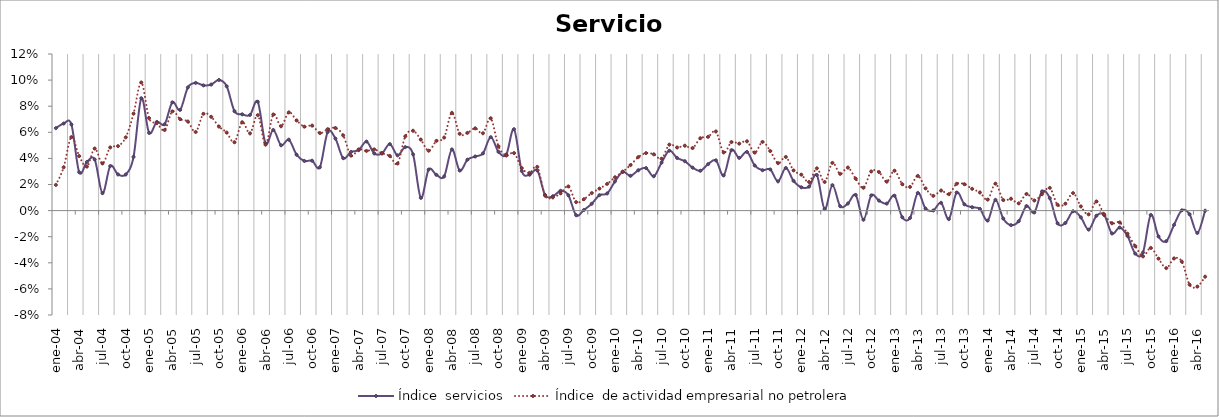
| Category | Índice  servicios | Índice  de actividad empresarial no petrolera |
|---|---|---|
| 2004-01-01 | 0.063 | 0.02 |
| 2004-02-01 | 0.067 | 0.033 |
| 2004-03-01 | 0.066 | 0.056 |
| 2004-04-01 | 0.029 | 0.042 |
| 2004-05-01 | 0.037 | 0.034 |
| 2004-06-01 | 0.039 | 0.048 |
| 2004-07-01 | 0.013 | 0.036 |
| 2004-08-01 | 0.034 | 0.048 |
| 2004-09-01 | 0.028 | 0.049 |
| 2004-10-01 | 0.028 | 0.056 |
| 2004-11-01 | 0.041 | 0.074 |
| 2004-12-01 | 0.086 | 0.098 |
| 2005-01-01 | 0.06 | 0.071 |
| 2005-02-01 | 0.068 | 0.067 |
| 2005-03-01 | 0.066 | 0.062 |
| 2005-04-01 | 0.083 | 0.076 |
| 2005-05-01 | 0.077 | 0.07 |
| 2005-06-01 | 0.094 | 0.068 |
| 2005-07-01 | 0.098 | 0.06 |
| 2005-08-01 | 0.096 | 0.074 |
| 2005-09-01 | 0.097 | 0.072 |
| 2005-10-01 | 0.1 | 0.064 |
| 2005-11-01 | 0.095 | 0.06 |
| 2005-12-01 | 0.076 | 0.052 |
| 2006-01-01 | 0.074 | 0.068 |
| 2006-02-01 | 0.073 | 0.059 |
| 2006-03-01 | 0.083 | 0.073 |
| 2006-04-01 | 0.052 | 0.051 |
| 2006-05-01 | 0.062 | 0.074 |
| 2006-06-01 | 0.05 | 0.065 |
| 2006-07-01 | 0.054 | 0.075 |
| 2006-08-01 | 0.043 | 0.069 |
| 2006-09-01 | 0.038 | 0.064 |
| 2006-10-01 | 0.038 | 0.065 |
| 2006-11-01 | 0.033 | 0.059 |
| 2006-12-01 | 0.06 | 0.062 |
| 2007-01-01 | 0.055 | 0.063 |
| 2007-02-01 | 0.04 | 0.058 |
| 2007-03-01 | 0.045 | 0.042 |
| 2007-04-01 | 0.046 | 0.047 |
| 2007-05-01 | 0.053 | 0.046 |
| 2007-06-01 | 0.044 | 0.047 |
| 2007-07-01 | 0.044 | 0.044 |
| 2007-08-01 | 0.051 | 0.042 |
| 2007-09-01 | 0.042 | 0.036 |
| 2007-10-01 | 0.049 | 0.057 |
| 2007-11-01 | 0.043 | 0.061 |
| 2007-12-01 | 0.01 | 0.054 |
| 2008-01-01 | 0.031 | 0.046 |
| 2008-02-01 | 0.027 | 0.053 |
| 2008-03-01 | 0.026 | 0.056 |
| 2008-04-01 | 0.047 | 0.075 |
| 2008-05-01 | 0.031 | 0.059 |
| 2008-06-01 | 0.039 | 0.06 |
| 2008-07-01 | 0.041 | 0.063 |
| 2008-08-01 | 0.044 | 0.059 |
| 2008-09-01 | 0.056 | 0.071 |
| 2008-10-01 | 0.045 | 0.049 |
| 2008-11-01 | 0.043 | 0.042 |
| 2008-12-01 | 0.062 | 0.044 |
| 2009-01-01 | 0.03 | 0.033 |
| 2009-02-01 | 0.027 | 0.029 |
| 2009-03-01 | 0.031 | 0.033 |
| 2009-04-01 | 0.012 | 0.012 |
| 2009-05-01 | 0.011 | 0.01 |
| 2009-06-01 | 0.015 | 0.013 |
| 2009-07-01 | 0.012 | 0.019 |
| 2009-08-01 | -0.004 | 0.006 |
| 2009-09-01 | 0 | 0.009 |
| 2009-10-01 | 0.005 | 0.013 |
| 2009-11-01 | 0.012 | 0.017 |
| 2009-12-01 | 0.013 | 0.02 |
| 2010-01-01 | 0.022 | 0.026 |
| 2010-02-01 | 0.03 | 0.03 |
| 2010-03-01 | 0.027 | 0.035 |
| 2010-04-01 | 0.031 | 0.041 |
| 2010-05-01 | 0.033 | 0.044 |
| 2010-06-01 | 0.026 | 0.043 |
| 2010-07-01 | 0.037 | 0.04 |
| 2010-08-01 | 0.046 | 0.051 |
| 2010-09-01 | 0.04 | 0.048 |
| 2010-10-01 | 0.038 | 0.05 |
| 2010-11-01 | 0.033 | 0.048 |
| 2010-12-01 | 0.031 | 0.055 |
| 2011-01-01 | 0.036 | 0.057 |
| 2011-02-01 | 0.039 | 0.061 |
| 2011-03-01 | 0.027 | 0.045 |
| 2011-04-01 | 0.046 | 0.053 |
| 2011-05-01 | 0.04 | 0.051 |
| 2011-06-01 | 0.045 | 0.053 |
| 2011-07-01 | 0.035 | 0.044 |
| 2011-08-01 | 0.031 | 0.053 |
| 2011-09-01 | 0.032 | 0.046 |
| 2011-10-01 | 0.022 | 0.036 |
| 2011-11-01 | 0.033 | 0.041 |
| 2011-12-01 | 0.023 | 0.031 |
| 2012-01-01 | 0.018 | 0.028 |
| 2012-02-01 | 0.018 | 0.022 |
| 2012-03-01 | 0.027 | 0.032 |
| 2012-04-01 | 0.001 | 0.022 |
| 2012-05-01 | 0.02 | 0.037 |
| 2012-06-01 | 0.003 | 0.028 |
| 2012-07-01 | 0.005 | 0.033 |
| 2012-08-01 | 0.012 | 0.024 |
| 2012-09-01 | -0.007 | 0.018 |
| 2012-10-01 | 0.012 | 0.03 |
| 2012-11-01 | 0.008 | 0.03 |
| 2012-12-01 | 0.005 | 0.022 |
| 2013-01-01 | 0.011 | 0.031 |
| 2013-02-01 | -0.005 | 0.02 |
| 2013-03-01 | -0.006 | 0.018 |
| 2013-04-01 | 0.014 | 0.027 |
| 2013-05-01 | 0.002 | 0.017 |
| 2013-06-01 | 0 | 0.011 |
| 2013-07-01 | 0.006 | 0.015 |
| 2013-08-01 | -0.007 | 0.013 |
| 2013-09-01 | 0.014 | 0.021 |
| 2013-10-01 | 0.005 | 0.02 |
| 2013-11-01 | 0.003 | 0.017 |
| 2013-12-01 | 0.001 | 0.014 |
| 2014-01-01 | -0.008 | 0.008 |
| 2014-02-01 | 0.008 | 0.021 |
| 2014-03-01 | -0.006 | 0.008 |
| 2014-04-01 | -0.011 | 0.009 |
| 2014-05-01 | -0.008 | 0.006 |
| 2014-06-01 | 0.003 | 0.013 |
| 2014-07-01 | -0.001 | 0.008 |
| 2014-08-01 | 0.015 | 0.013 |
| 2014-09-01 | 0.01 | 0.017 |
| 2014-10-01 | -0.01 | 0.004 |
| 2014-11-01 | -0.01 | 0.005 |
| 2014-12-01 | 0 | 0.013 |
| 2015-01-01 | -0.005 | 0.003 |
| 2015-02-01 | -0.015 | -0.003 |
| 2015-03-01 | -0.004 | 0.007 |
| 2015-04-01 | -0.003 | -0.003 |
| 2015-05-01 | -0.018 | -0.01 |
| 2015-06-01 | -0.013 | -0.009 |
| 2015-07-01 | -0.019 | -0.018 |
| 2015-08-01 | -0.033 | -0.027 |
| 2015-09-01 | -0.032 | -0.035 |
| 2015-10-01 | -0.003 | -0.029 |
| 2015-11-01 | -0.02 | -0.037 |
| 2015-12-01 | -0.023 | -0.044 |
| 2016-01-01 | -0.011 | -0.037 |
| 2016-02-01 | 0 | -0.039 |
| 2016-03-01 | -0.003 | -0.057 |
| 2016-04-01 | -0.017 | -0.058 |
| 2016-05-01 | 0 | -0.051 |